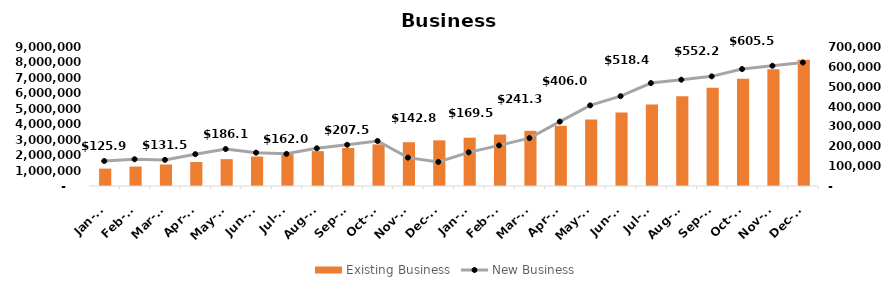
| Category | Existing Business |
|---|---|
| 2023-01-31 | 1125915.929 |
| 2023-02-28 | 1260644.902 |
| 2023-03-31 | 1392161.344 |
| 2023-04-30 | 1552491.764 |
| 2023-05-31 | 1738625.771 |
| 2023-06-30 | 1906428.218 |
| 2023-07-31 | 2068383.373 |
| 2023-08-31 | 2258261.124 |
| 2023-09-30 | 2465800.908 |
| 2023-10-31 | 2692576.581 |
| 2023-11-30 | 2835353.872 |
| 2023-12-31 | 2956511.128 |
| 2024-01-31 | 3126052.061 |
| 2024-02-29 | 3330495.749 |
| 2024-03-31 | 3571792.774 |
| 2024-04-30 | 3896062.017 |
| 2024-05-31 | 4302085.645 |
| 2024-06-30 | 4754293.132 |
| 2024-07-31 | 5272707.373 |
| 2024-08-31 | 5808071.128 |
| 2024-09-30 | 6360282.702 |
| 2024-10-31 | 6949301.006 |
| 2024-11-30 | 7554845.199 |
| 2024-12-31 | 8176816.128 |